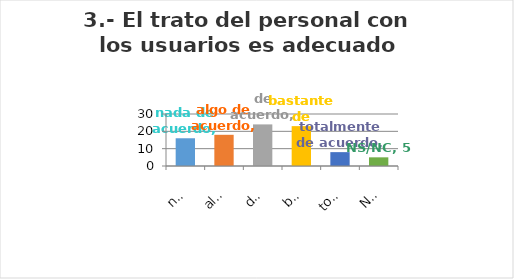
| Category | Series 0 |
|---|---|
| nada de acuerdo | 16 |
| algo de acuerdo | 18 |
| de acuerdo | 24 |
| bastante de acuerdo | 23 |
| totalmente de acuerdo | 8 |
| NS/NC | 5 |